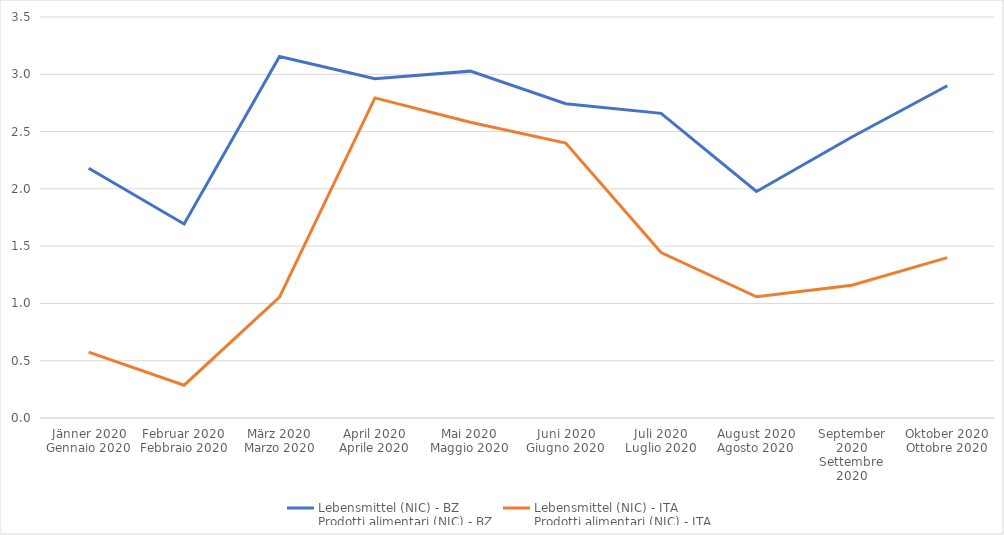
| Category | Lebensmittel (NIC) - BZ
Prodotti alimentari (NIC) - BZ | Lebensmittel (NIC) - ITA
Prodotti alimentari (NIC) - ITA |
|---|---|---|
| Jänner 2020
Gennaio 2020 | 2.18 | 0.575 |
| Februar 2020
Febbraio 2020 | 1.693 | 0.286 |
| März 2020
Marzo 2020 | 3.155 | 1.056 |
| April 2020
Aprile 2020 | 2.961 | 2.794 |
| Mai 2020
Maggio 2020 | 3.027 | 2.581 |
| Juni 2020
Giugno 2020 | 2.744 | 2.399 |
| Juli 2020
Luglio 2020 | 2.659 | 1.444 |
| August 2020
Agosto 2020 | 1.977 | 1.058 |
| September 2020
Settembre 2020 | 2.453 | 1.158 |
| Oktober 2020
Ottobre 2020 | 2.9 | 1.4 |